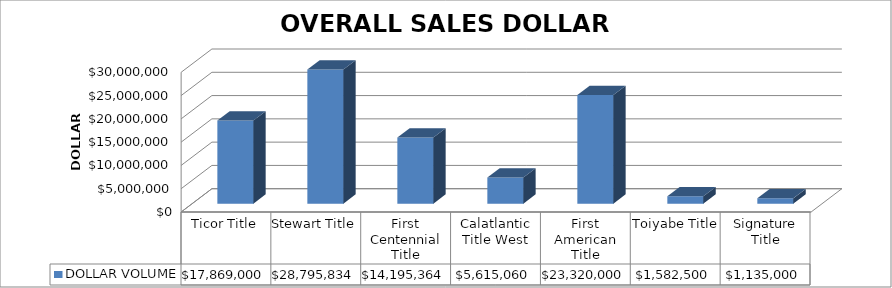
| Category | DOLLAR VOLUME |
|---|---|
| Ticor Title | 17869000 |
| Stewart Title | 28795834 |
| First Centennial Title | 14195364 |
| Calatlantic Title West | 5615060 |
| First American Title | 23320000 |
| Toiyabe Title | 1582500 |
| Signature Title | 1135000 |